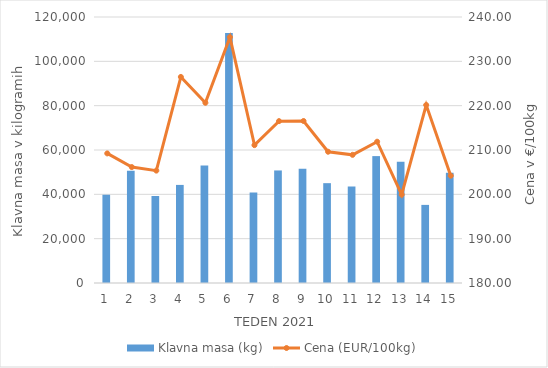
| Category | Klavna masa (kg) |
|---|---|
| 1.0 | 39814 |
| 2.0 | 50603 |
| 3.0 | 39295 |
| 4.0 | 44250 |
| 5.0 | 53061 |
| 6.0 | 112816 |
| 7.0 | 40829 |
| 8.0 | 50775 |
| 9.0 | 51535 |
| 10.0 | 45040 |
| 11.0 | 43536 |
| 12.0 | 57246 |
| 13.0 | 54680 |
| 14.0 | 35237 |
| 15.0 | 49721 |